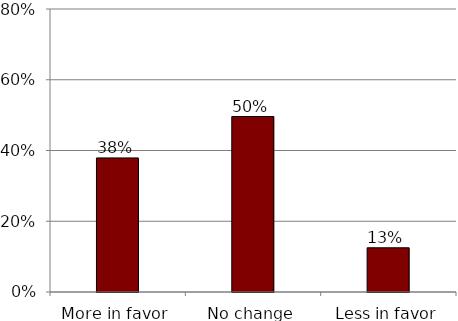
| Category | 0 |
|---|---|
| More in favor | 0.379 |
| No change | 0.496 |
| Less in favor | 0.125 |